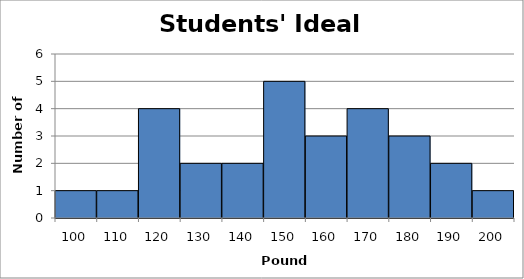
| Category | Series 0 |
|---|---|
| 100.0 | 1 |
| 110.0 | 1 |
| 120.0 | 4 |
| 130.0 | 2 |
| 140.0 | 2 |
| 150.0 | 5 |
| 160.0 | 3 |
| 170.0 | 4 |
| 180.0 | 3 |
| 190.0 | 2 |
| 200.0 | 1 |